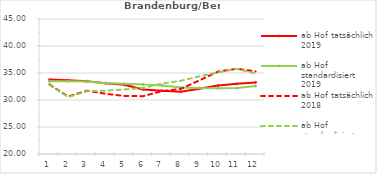
| Category | ab Hof tatsächlich 2019 | ab Hof standardisiert 2019 | ab Hof tatsächlich 2018 | ab Hof standardisiert 2018 |
|---|---|---|---|---|
| 0 | 33.774 | 33.469 | 32.907 | 32.807 |
| 1 | 33.648 | 33.484 | 30.632 | 30.522 |
| 2 | 33.49 | 33.414 | 31.729 | 31.611 |
| 3 | 33.089 | 33.099 | 31.151 | 31.733 |
| 4 | 32.818 | 33.001 | 30.753 | 31.943 |
| 5 | 31.963 | 32.893 | 30.703 | 32.228 |
| 6 | 31.728 | 32.682 | 31.646 | 33.044 |
| 7 | 31.531 | 32.326 | 32.042 | 33.553 |
| 8 | 32.072 | 32.201 | 33.631 | 34.381 |
| 9 | 32.697 | 32.177 | 35.265 | 35.132 |
| 10 | 32.992 | 32.211 | 35.782 | 35.752 |
| 11 | 33.258 | 32.579 | 35.301 | 34.911 |